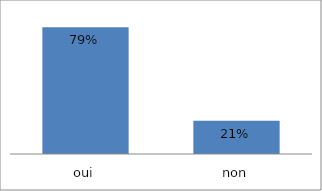
| Category | Series 0 |
|---|---|
| oui | 0.792 |
| non | 0.208 |